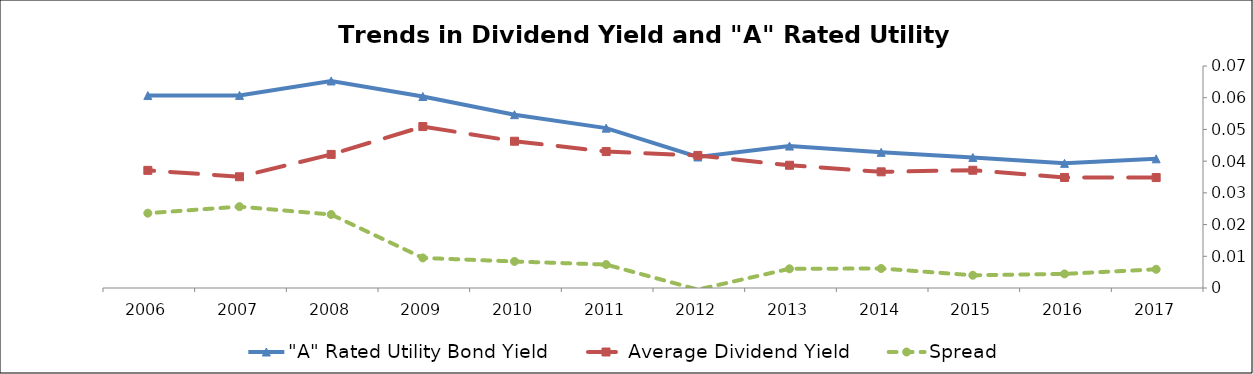
| Category | "A" Rated Utility Bond Yield | Average Dividend Yield | Spread |
|---|---|---|---|
| 2017.0 | 0.041 | 0.035 | 0.006 |
| 2016.0 | 0.039 | 0.035 | 0.004 |
| 2015.0 | 0.041 | 0.037 | 0.004 |
| 2014.0 | 0.043 | 0.037 | 0.006 |
| 2013.0 | 0.045 | 0.039 | 0.006 |
| 2012.0 | 0.041 | 0.042 | 0 |
| 2011.0 | 0.05 | 0.043 | 0.007 |
| 2010.0 | 0.055 | 0.046 | 0.008 |
| 2009.0 | 0.06 | 0.051 | 0.009 |
| 2008.0 | 0.065 | 0.042 | 0.023 |
| 2007.0 | 0.061 | 0.035 | 0.026 |
| 2006.0 | 0.061 | 0.037 | 0.024 |